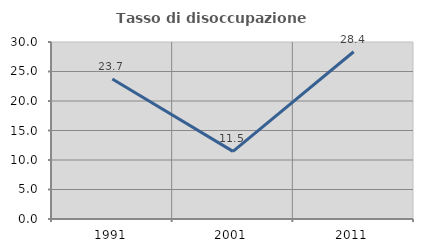
| Category | Tasso di disoccupazione giovanile  |
|---|---|
| 1991.0 | 23.72 |
| 2001.0 | 11.468 |
| 2011.0 | 28.351 |